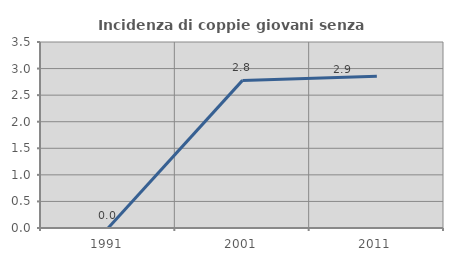
| Category | Incidenza di coppie giovani senza figli |
|---|---|
| 1991.0 | 0 |
| 2001.0 | 2.778 |
| 2011.0 | 2.857 |